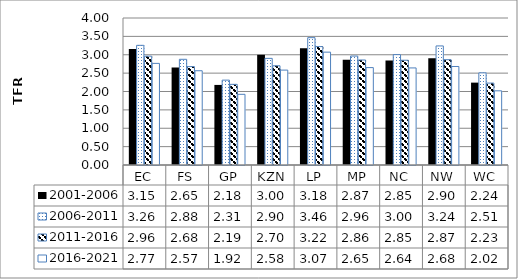
| Category | 2001-2006 | 2006-2011 | 2011-2016 | 2016-2021 |
|---|---|---|---|---|
| EC | 3.154 | 3.256 | 2.961 | 2.765 |
| FS | 2.654 | 2.876 | 2.678 | 2.565 |
| GP | 2.179 | 2.309 | 2.195 | 1.923 |
| KZN | 2.999 | 2.901 | 2.7 | 2.582 |
| LP | 3.178 | 3.465 | 3.222 | 3.071 |
| MP | 2.867 | 2.964 | 2.857 | 2.65 |
| NC | 2.847 | 3.003 | 2.851 | 2.641 |
| NW | 2.904 | 3.24 | 2.866 | 2.681 |
| WC | 2.241 | 2.508 | 2.229 | 2.018 |